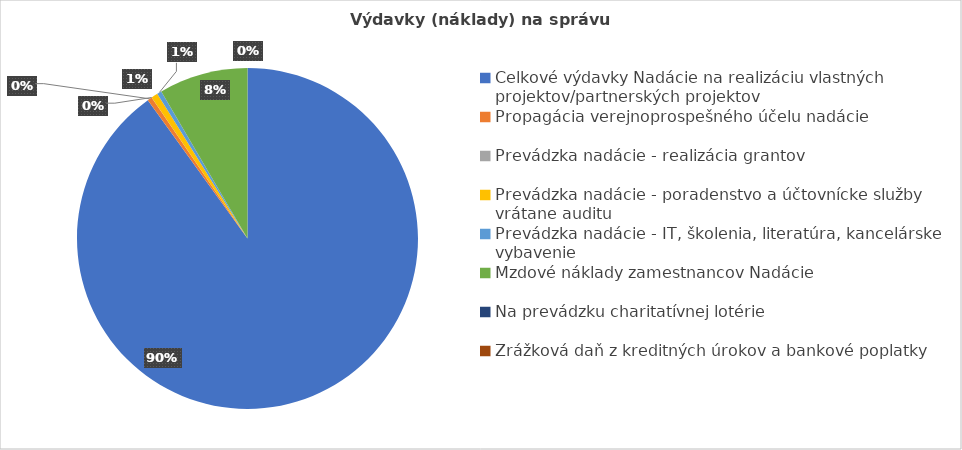
| Category | Celkové výdavky na správu |
|---|---|
| Celkové výdavky Nadácie na realizáciu vlastných projektov/partnerských projektov | 546266.97 |
| Propagácia verejnoprospešného účelu nadácie  | 2614.86 |
| Prevádzka nadácie - realizácia grantov | 33.41 |
| Prevádzka nadácie - poradenstvo a účtovnícke služby vrátane auditu | 3765.45 |
| Prevádzka nadácie - IT, školenia, literatúra, kancelárske vybavenie | 2667.39 |
| Mzdové náklady zamestnancov Nadácie  | 51173.65 |
| Na prevádzku charitatívnej lotérie | 0 |
| Zrážková daň z kreditných úrokov a bankové poplatky | 3.13 |